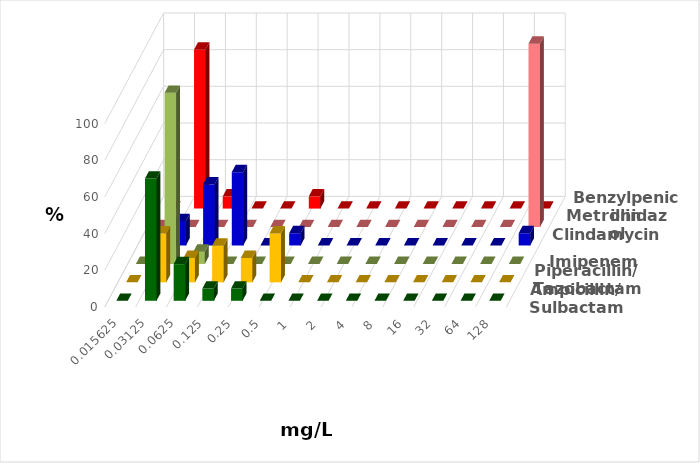
| Category | Ampicillin/ Sulbactam | Piperacillin/ Tazobactam | Imipenem | Clindamycin | Metronidazol | Benzylpenicillin |
|---|---|---|---|---|---|---|
| 0.015625 | 0 | 0 | 0 | 0 | 0 | 0 |
| 0.03125 | 66.667 | 26.667 | 93.333 | 13.333 | 0 | 86.667 |
| 0.0625 | 20 | 13.333 | 6.667 | 33.333 | 0 | 6.667 |
| 0.125 | 6.667 | 20 | 0 | 40 | 0 | 0 |
| 0.25 | 6.667 | 13.333 | 0 | 0 | 0 | 0 |
| 0.5 | 0 | 26.667 | 0 | 6.667 | 0 | 6.667 |
| 1.0 | 0 | 0 | 0 | 0 | 0 | 0 |
| 2.0 | 0 | 0 | 0 | 0 | 0 | 0 |
| 4.0 | 0 | 0 | 0 | 0 | 0 | 0 |
| 8.0 | 0 | 0 | 0 | 0 | 0 | 0 |
| 16.0 | 0 | 0 | 0 | 0 | 0 | 0 |
| 32.0 | 0 | 0 | 0 | 0 | 0 | 0 |
| 64.0 | 0 | 0 | 0 | 0 | 0 | 0 |
| 128.0 | 0 | 0 | 0 | 6.667 | 100 | 0 |